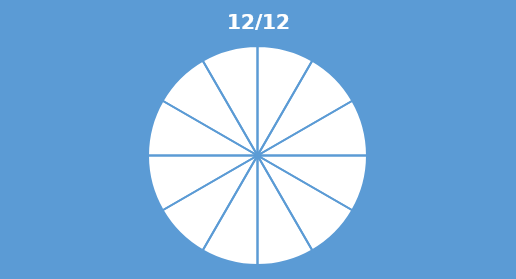
| Category | Series 0 |
|---|---|
| 0 | 0.083 |
| 1 | 0.083 |
| 2 | 0.083 |
| 3 | 0.083 |
| 4 | 0.083 |
| 5 | 0.083 |
| 6 | 0.083 |
| 7 | 0.083 |
| 8 | 0.083 |
| 9 | 0.083 |
| 10 | 0.083 |
| 11 | 0.083 |